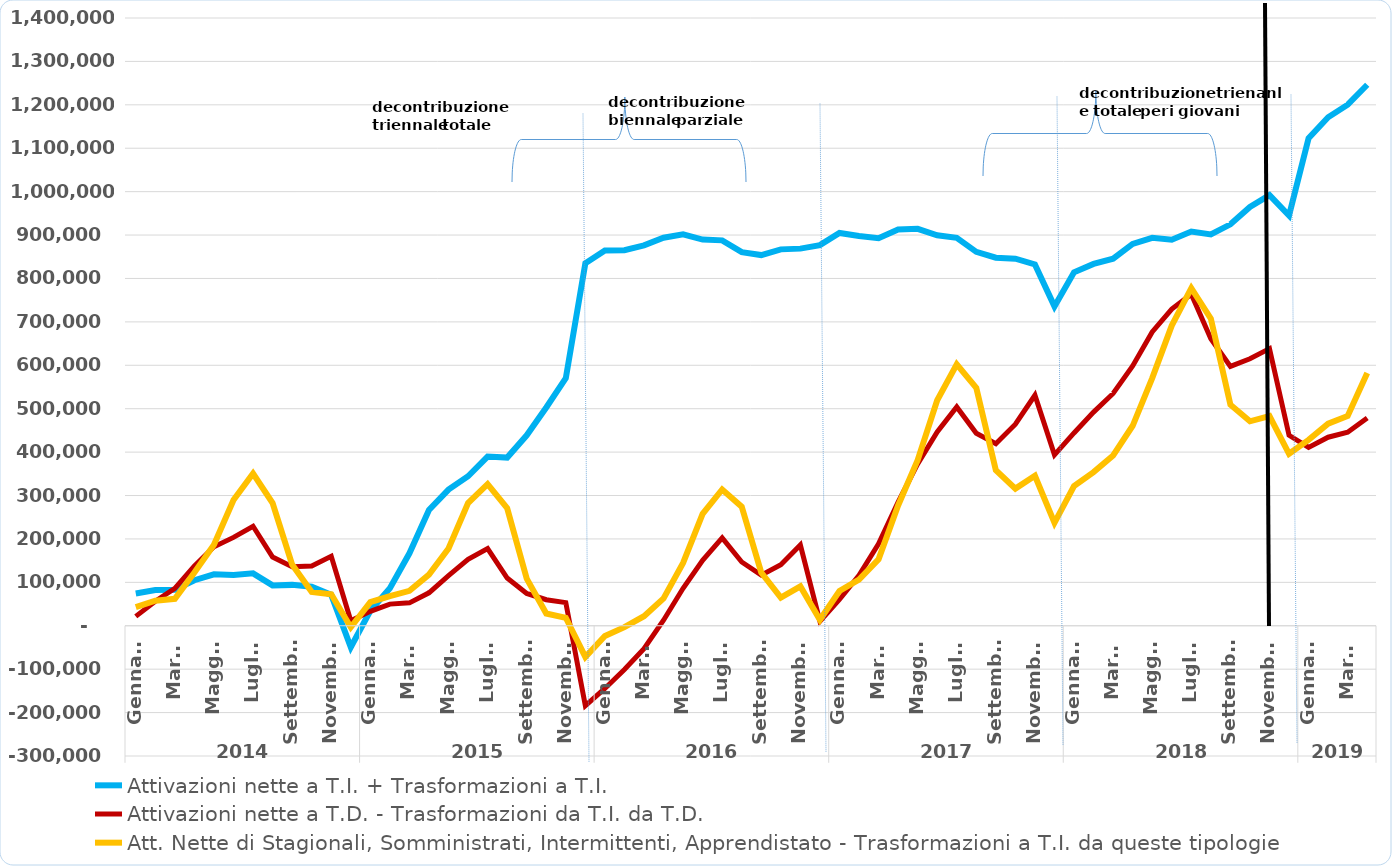
| Category | Attivazioni nette a T.I. + Trasformazioni a T.I. | Attivazioni nette a T.D. - Trasformazioni da T.I. da T.D. | Att. Nette di Stagionali, Somministrati, Intermittenti, Apprendistato - Trasformazioni a T.I. da queste tipologie |
|---|---|---|---|
| 0 | 74347 | 21621 | 43053 |
| 1 | 82363 | 56476 | 57874 |
| 2 | 82775 | 85957 | 62104 |
| 3 | 104880 | 137833 | 122510 |
| 4 | 118571 | 181906 | 186488 |
| 5 | 116887 | 203553 | 289816 |
| 6 | 120790 | 229239 | 350711 |
| 7 | 93006 | 158252 | 282576 |
| 8 | 94183 | 135779 | 140963 |
| 9 | 89881 | 137635 | 77883 |
| 10 | 71188 | 159855 | 72469 |
| 11 | -49553 | 11633 | -3406 |
| 12 | 34586 | 33257 | 54600 |
| 13 | 86505 | 49847 | 68363 |
| 14 | 166891 | 52776 | 80574 |
| 15 | 266837 | 75913 | 117900 |
| 16 | 313687 | 115717 | 178013 |
| 17 | 344361 | 153031 | 282699 |
| 18 | 389730 | 177625 | 326301 |
| 19 | 387431 | 109919 | 270791 |
| 20 | 438807 | 74401 | 108517 |
| 21 | 502927 | 59983 | 28145 |
| 22 | 570246 | 53297 | 18405 |
| 23 | 835038 | -183943 | -71831 |
| 24 | 864551 | -144337 | -23555 |
| 25 | 865264 | -100667 | -3130 |
| 26 | 876222 | -52899 | 21989 |
| 27 | 893905 | 12793 | 62973 |
| 28 | 901860 | 86329 | 144932 |
| 29 | 889702 | 150919 | 257719 |
| 30 | 887817 | 202551 | 313976 |
| 31 | 860540 | 146922 | 274167 |
| 32 | 853883 | 116625 | 122300 |
| 33 | 867042 | 140683 | 64903 |
| 34 | 868741 | 186029 | 90690 |
| 35 | 876742 | 10388 | 13798 |
| 36 | 904858 | 60494 | 80043 |
| 37 | 897635 | 116450 | 106348 |
| 38 | 892864 | 188700 | 153008 |
| 39 | 912644 | 284655 | 277169 |
| 40 | 914415 | 372786 | 381374 |
| 41 | 899411 | 446435 | 519585 |
| 42 | 893512 | 503956 | 602313 |
| 43 | 861381 | 443402 | 547981 |
| 44 | 847870 | 419506 | 358316 |
| 45 | 845520 | 464361 | 316002 |
| 46 | 832319 | 531035 | 345604 |
| 47 | 735694 | 393721 | 237100 |
| 48 | 814255 | 444167 | 321947 |
| 49 | 833424 | 492104 | 353869 |
| 50 | 845581 | 535137 | 392161 |
| 51 | 879679 | 598392 | 460696 |
| 52 | 893653 | 676798 | 570608 |
| 53 | 889114 | 729604 | 691486 |
| 54 | 908156 | 763611 | 777612 |
| 55 | 901301 | 661227 | 707428 |
| 56 | 924771 | 597336 | 509268 |
| 57 | 964572 | 615086 | 470967 |
| 58 | 991940 | 638342 | 483133 |
| 59 | 945074 | 438753 | 396184 |
| 60 | 1122835 | 410843 | 428251 |
| 61 | 1171276 | 434339 | 465478 |
| 62 | 1200275 | 445758 | 483328 |
| 63 | 1246302 | 478683 | 582061 |